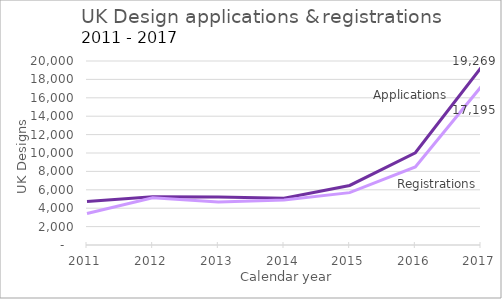
| Category | Applications | Registrations |
|---|---|---|
| 2011.0 | 4730 | 3423 |
| 2012.0 | 5231 | 5144 |
| 2013.0 | 5210 | 4671 |
| 2014.0 | 5084 | 4901 |
| 2015.0 | 6472 | 5690 |
| 2016.0 | 10030 | 8481 |
| 2017.0 | 19269 | 17195 |